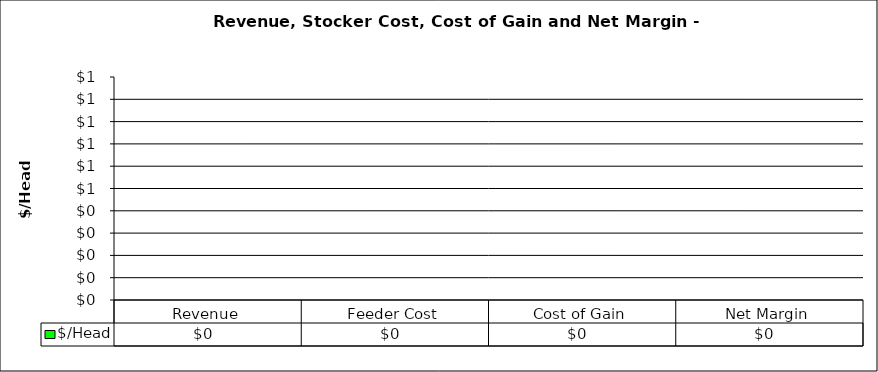
| Category | $/Head |
|---|---|
| Revenue | 0 |
| Feeder Cost | 0 |
| Cost of Gain | 0 |
| Net Margin | 0 |